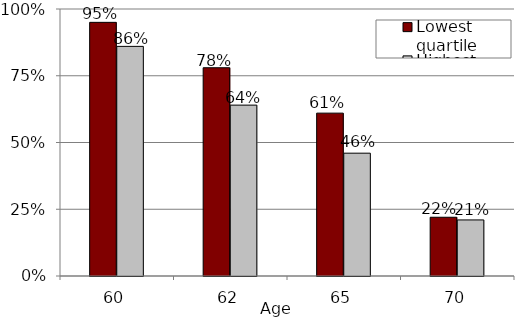
| Category | Lowest quartile | Highest quartile |
|---|---|---|
| 60.0 | 0.95 | 0.86 |
| 62.0 | 0.78 | 0.64 |
| 65.0 | 0.61 | 0.46 |
| 70.0 | 0.22 | 0.21 |